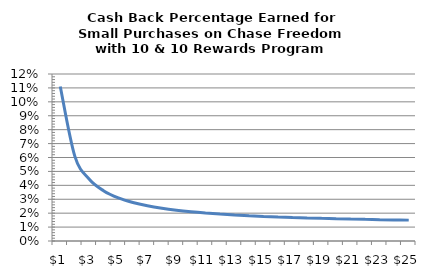
| Category | Cash Back Percentage |
|---|---|
| 0 | 0.111 |
| 1 | 0.061 |
| 2 | 0.044 |
| 3 | 0.036 |
| 4 | 0.031 |
| 5 | 0.028 |
| 6 | 0.025 |
| 7 | 0.024 |
| 8 | 0.022 |
| 9 | 0.021 |
| 10 | 0.02 |
| 11 | 0.019 |
| 12 | 0.019 |
| 13 | 0.018 |
| 14 | 0.018 |
| 15 | 0.017 |
| 16 | 0.017 |
| 17 | 0.017 |
| 18 | 0.016 |
| 19 | 0.016 |
| 20 | 0.016 |
| 21 | 0.016 |
| 22 | 0.015 |
| 23 | 0.015 |
| 24 | 0.015 |